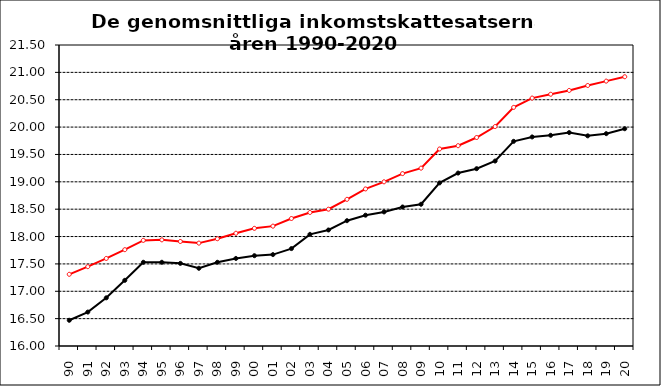
| Category | Series 2 | Series 3 |
|---|---|---|
| 90 | 16.47 | 17.31 |
| 91 | 16.62 | 17.45 |
| 92 | 16.88 | 17.6 |
| 93 | 17.2 | 17.76 |
| 94 | 17.53 | 17.93 |
| 95 | 17.53 | 17.94 |
| 96 | 17.51 | 17.91 |
| 97 | 17.42 | 17.88 |
| 98 | 17.53 | 17.96 |
| 99 | 17.6 | 18.06 |
| 00 | 17.65 | 18.15 |
| 01 | 17.67 | 18.19 |
| 02 | 17.78 | 18.33 |
| 03 | 18.04 | 18.44 |
| 04 | 18.12 | 18.5 |
| 05 | 18.29 | 18.68 |
| 06 | 18.39 | 18.87 |
| 07 | 18.45 | 19 |
| 08 | 18.54 | 19.15 |
| 09 | 18.59 | 19.25 |
| 10 | 18.98 | 19.6 |
| 11 | 19.16 | 19.66 |
| 12 | 19.24 | 19.81 |
| 13 | 19.38 | 20.01 |
| 14 | 19.74 | 20.36 |
| 15 | 19.82 | 20.53 |
| 16 | 19.85 | 20.6 |
| 17 | 19.9 | 20.67 |
| 18 | 19.84 | 20.76 |
| 19 | 19.88 | 20.84 |
| 20 | 19.97 | 20.92 |